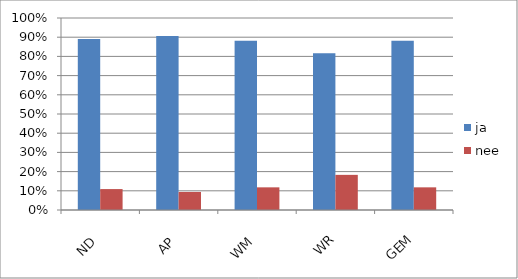
| Category | ja | nee |
|---|---|---|
| ND | 0.891 | 0.109 |
| AP | 0.906 | 0.094 |
| WM | 0.882 | 0.118 |
| WR | 0.817 | 0.183 |
| GEM | 0.882 | 0.118 |